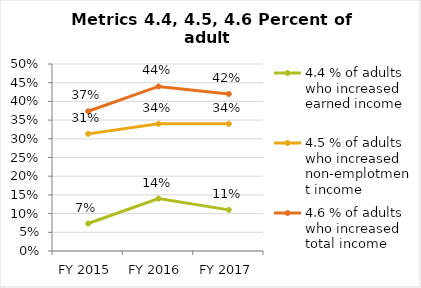
| Category | 4.4 % of adults who increased earned income | 4.5 % of adults who increased non-emplotment income | 4.6 % of adults who increased total income |
|---|---|---|---|
| FY 2015 | 0.073 | 0.313 | 0.374 |
| FY 2016 | 0.14 | 0.34 | 0.44 |
| FY 2017 | 0.11 | 0.34 | 0.42 |